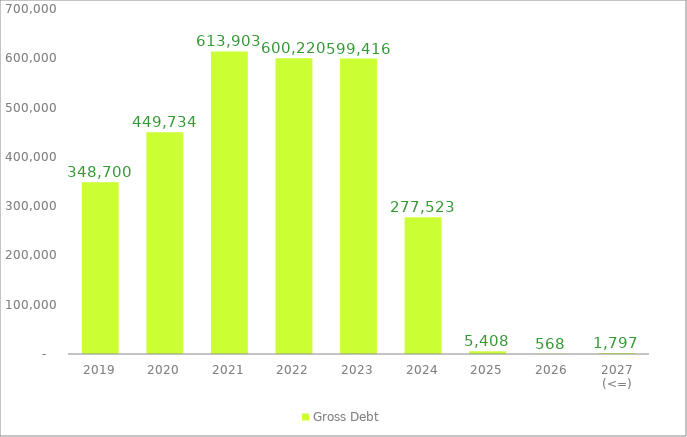
| Category | Gross Debt |
|---|---|
| 2019 | 348699.609 |
| 2020 | 449733.819 |
| 2021 | 613902.741 |
| 2022 | 600220.201 |
| 2023 | 599415.978 |
| 2024 | 277523.459 |
| 2025 | 5407.91 |
| 2026 | 567.533 |
| 2027 (<=) | 1797.188 |